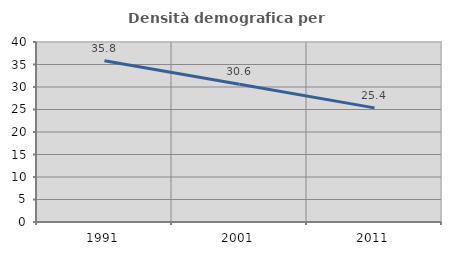
| Category | Densità demografica |
|---|---|
| 1991.0 | 35.833 |
| 2001.0 | 30.596 |
| 2011.0 | 25.359 |